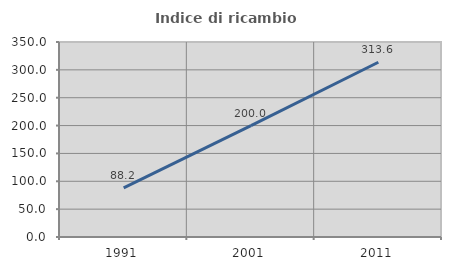
| Category | Indice di ricambio occupazionale  |
|---|---|
| 1991.0 | 88.235 |
| 2001.0 | 200 |
| 2011.0 | 313.636 |